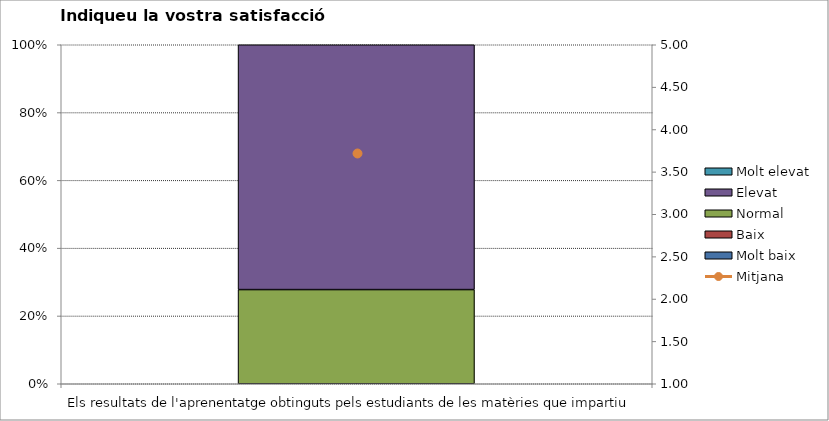
| Category | Molt baix | Baix | Normal  | Elevat | Molt elevat |
|---|---|---|---|---|---|
| Els resultats de l'aprenentatge obtinguts pels estudiants de les matèries que impartiu | 0 | 0 | 5 | 13 | 0 |